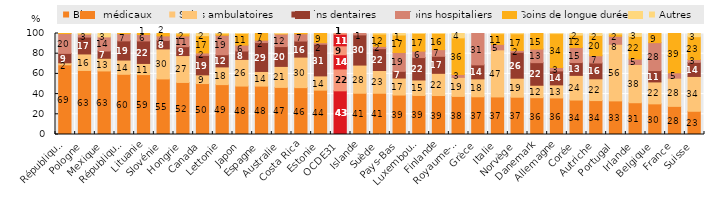
| Category | Biens médicaux | Soins ambulatoires | Soins dentaires | Soins hospitaliers | Soins de longue durée | Autres |
|---|---|---|---|---|---|---|
| République slovaque | 69.009 | 1.995 | 9.316 | 19.632 | 0.049 | 0 |
| Pologne | 63.414 | 16.345 | 16.707 | 3.123 | 0.078 | 0.333 |
| Mexique | 62.935 | 12.552 | 7.204 | 13.949 | 0 | 3.361 |
| République tchèque | 59.609 | 14.118 | 18.979 | 7.113 | 0.182 | 0 |
| Lituanie | 59.327 | 11.024 | 22.306 | 6.33 | 1.013 | 0 |
| Slovénie | 55.025 | 29.727 | 8.43 | 4.464 | 2.353 | 0 |
| Hongrie | 51.546 | 26.616 | 8.802 | 10.618 | 2.202 | 0.215 |
| Canada | 50.439 | 8.597 | 19.323 | 2.393 | 17.06 | 2.189 |
| Lettonie | 49.392 | 17.543 | 12.029 | 19.305 | 1.509 | 0.221 |
| Japon | 47.951 | 26.394 | 8.346 | 5.866 | 11.436 | 0.008 |
| Espagne | 47.918 | 14.496 | 28.621 | 2.414 | 6.551 | 0 |
| Australie | 46.629 | 20.778 | 19.648 | 12.481 | 0.328 | 0.136 |
| Costa Rica | 46.408 | 30.214 | 15.927 | 7.141 | 0.309 | 0 |
| Estonie | 43.921 | 14.115 | 31.327 | 1.625 | 9.013 | 0 |
| OCDE31 | 43.241 | 21.618 | 14.115 | 8.834 | 11.439 | 0.753 |
| Islande | 40.84 | 27.888 | 29.908 | 1.364 | 0 | 0 |
| Suède | 40.819 | 22.548 | 21.634 | 2.211 | 12.296 | 0.492 |
| Pays-Bas | 39.058 | 16.843 | 6.629 | 18.692 | 17.307 | 1.471 |
| Luxembourg | 38.653 | 15.336 | 22.17 | 6.385 | 17.453 | 0.003 |
| Finlande | 38.575 | 21.99 | 16.874 | 6.613 | 15.939 | 0.009 |
| Royaume-Uni | 37.706 | 18.863 | 0 | 2.877 | 36.238 | 4.316 |
| Grèce | 37.335 | 17.751 | 13.877 | 31.038 | 0 | 0 |
| Italie | 37.193 | 46.623 | 0 | 5.429 | 10.576 | 0.178 |
| Norvège | 36.917 | 18.813 | 25.671 | 1.847 | 16.5 | 0.251 |
| Danemark | 36.438 | 12.311 | 22.38 | 13.494 | 15.377 | 0 |
| Allemagne | 36.201 | 12.929 | 13.862 | 3.314 | 33.579 | 0.119 |
| Corée | 34.116 | 24.409 | 12.694 | 14.918 | 12.287 | 1.575 |
| Autriche | 33.588 | 21.569 | 15.662 | 7.158 | 20.12 | 1.903 |
| Portugal | 33.289 | 56.051 | 0 | 7.916 | 2.261 | 0.483 |
| Irlande | 31.454 | 37.85 | 0 | 5.365 | 22.447 | 2.884 |
| Belgique | 30.333 | 21.714 | 11.253 | 27.665 | 9.034 | 0 |
| France | 27.845 | 27.91 | 0 | 5.369 | 38.877 | 0 |
| Suisse | 23.005 | 34.467 | 13.913 | 2.895 | 22.539 | 3.181 |